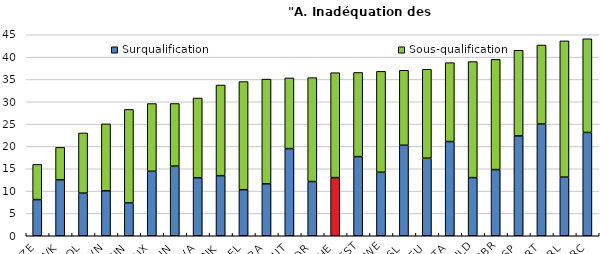
| Category | Surqualification | Sous-qualification |
|---|---|---|
| CZE | 8.09 | 7.88 |
| SVK | 12.51 | 7.28 |
| POL | 9.54 | 13.48 |
| SVN | 10.07 | 14.98 |
| FIN | 7.35 | 20.94 |
| LUX | 14.43 | 15.17 |
| HUN | 15.59 | 14.02 |
| LVA | 12.99 | 17.85 |
| DNK | 13.45 | 20.3 |
| BEL | 10.31 | 24.21 |
| FRA | 11.63 | 23.44 |
| AUT | 19.51 | 15.83 |
| NOR | 12.14 | 23.26 |
| CHE | 13.02 | 23.49 |
| EST | 17.72 | 18.84 |
| SWE | 14.22 | 22.59 |
| ISL | 20.26 | 16.79 |
| DEU | 17.37 | 19.9 |
| ITA | 21.09 | 17.66 |
| NLD | 13.01 | 25.99 |
| GBR | 14.81 | 24.68 |
| ESP | 22.37 | 19.16 |
| PRT | 25.02 | 17.69 |
| IRL | 13.13 | 30.5 |
| GRC | 23.13 | 20.97 |